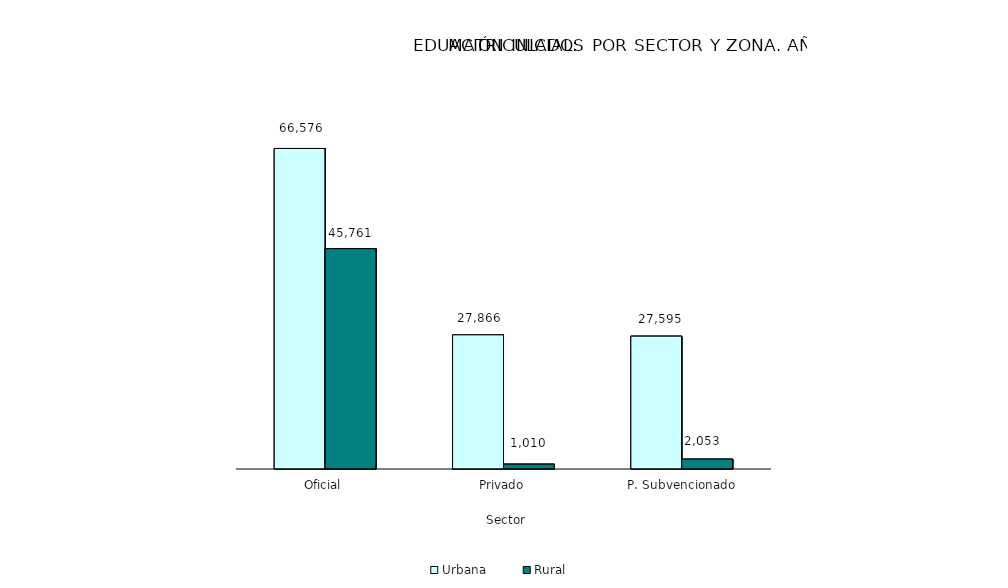
| Category | Urbana | Rural |
|---|---|---|
| Oficial | 66576 | 45761 |
| Privado | 27866 | 1010 |
| P. Subvencionado | 27595 | 2053 |